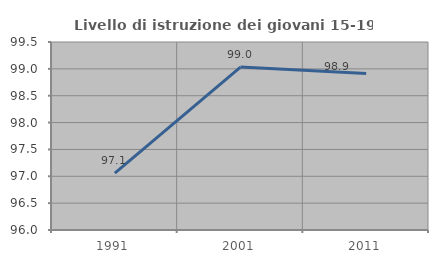
| Category | Livello di istruzione dei giovani 15-19 anni |
|---|---|
| 1991.0 | 97.059 |
| 2001.0 | 99.034 |
| 2011.0 | 98.913 |